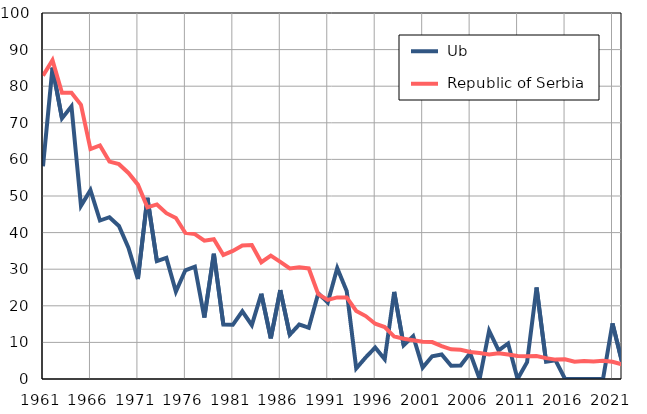
| Category |  Ub |  Republic of Serbia |
|---|---|---|
| 1961.0 | 58.1 | 82.9 |
| 1962.0 | 85.1 | 87.1 |
| 1963.0 | 71.2 | 78.2 |
| 1964.0 | 74.5 | 78.2 |
| 1965.0 | 47.3 | 74.9 |
| 1966.0 | 51.6 | 62.8 |
| 1967.0 | 43.3 | 63.8 |
| 1968.0 | 44.2 | 59.4 |
| 1969.0 | 41.8 | 58.7 |
| 1970.0 | 35.9 | 56.3 |
| 1971.0 | 27.3 | 53.1 |
| 1972.0 | 49.5 | 46.9 |
| 1973.0 | 32.2 | 47.7 |
| 1974.0 | 33.1 | 45.3 |
| 1975.0 | 23.9 | 44 |
| 1976.0 | 29.7 | 39.9 |
| 1977.0 | 30.7 | 39.6 |
| 1978.0 | 16.8 | 37.8 |
| 1979.0 | 34.2 | 38.2 |
| 1980.0 | 14.9 | 33.9 |
| 1981.0 | 14.8 | 35 |
| 1982.0 | 18.5 | 36.5 |
| 1983.0 | 14.7 | 36.6 |
| 1984.0 | 23.3 | 31.9 |
| 1985.0 | 11.1 | 33.7 |
| 1986.0 | 24.3 | 32 |
| 1987.0 | 12.1 | 30.2 |
| 1988.0 | 14.9 | 30.5 |
| 1989.0 | 14 | 30.2 |
| 1990.0 | 23.4 | 23.2 |
| 1991.0 | 20.9 | 21.6 |
| 1992.0 | 30.3 | 22.3 |
| 1993.0 | 24 | 22.3 |
| 1994.0 | 2.9 | 18.6 |
| 1995.0 | 5.9 | 17.2 |
| 1996.0 | 8.6 | 15.1 |
| 1997.0 | 5.4 | 14.2 |
| 1998.0 | 23.8 | 11.6 |
| 1999.0 | 9.2 | 11 |
| 2000.0 | 11.7 | 10.6 |
| 2001.0 | 3.1 | 10.2 |
| 2002.0 | 6.2 | 10.1 |
| 2003.0 | 6.7 | 9 |
| 2004.0 | 3.6 | 8.1 |
| 2005.0 | 3.7 | 8 |
| 2006.0 | 7.1 | 7.4 |
| 2007.0 | 0 | 7.1 |
| 2008.0 | 13.2 | 6.7 |
| 2009.0 | 7.8 | 7 |
| 2010.0 | 9.7 | 6.7 |
| 2011.0 | 0 | 6.3 |
| 2012.0 | 4.6 | 6.2 |
| 2013.0 | 25 | 6.3 |
| 2014.0 | 4.7 | 5.7 |
| 2015.0 | 5.1 | 5.3 |
| 2016.0 | 0 | 5.4 |
| 2017.0 | 0 | 4.7 |
| 2018.0 | 0 | 4.9 |
| 2019.0 | 0 | 4.8 |
| 2020.0 | 0 | 5 |
| 2021.0 | 15.2 | 4.7 |
| 2022.0 | 4.7 | 4 |